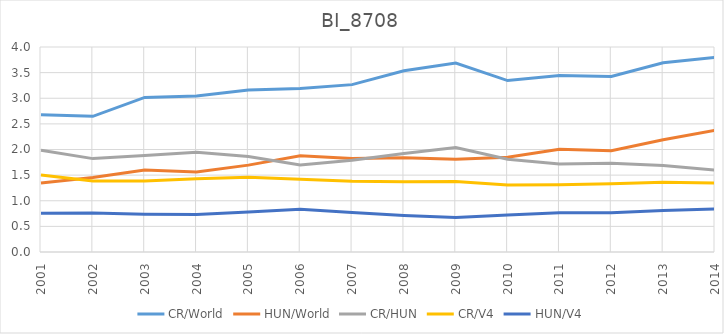
| Category | CR/World | HUN/World | CR/HUN | CR/V4 | HUN/V4 |
|---|---|---|---|---|---|
| 2001.0 | 2.676 | 1.347 | 1.986 | 1.502 | 0.757 |
| 2002.0 | 2.647 | 1.453 | 1.822 | 1.388 | 0.762 |
| 2003.0 | 3.016 | 1.6 | 1.884 | 1.388 | 0.736 |
| 2004.0 | 3.042 | 1.562 | 1.947 | 1.428 | 0.733 |
| 2005.0 | 3.161 | 1.695 | 1.865 | 1.46 | 0.783 |
| 2006.0 | 3.189 | 1.876 | 1.7 | 1.419 | 0.835 |
| 2007.0 | 3.266 | 1.823 | 1.792 | 1.379 | 0.77 |
| 2008.0 | 3.536 | 1.84 | 1.922 | 1.369 | 0.712 |
| 2009.0 | 3.687 | 1.81 | 2.037 | 1.374 | 0.674 |
| 2010.0 | 3.345 | 1.849 | 1.809 | 1.308 | 0.723 |
| 2011.0 | 3.444 | 2.006 | 1.717 | 1.311 | 0.764 |
| 2012.0 | 3.425 | 1.976 | 1.733 | 1.332 | 0.768 |
| 2013.0 | 3.691 | 2.19 | 1.685 | 1.362 | 0.808 |
| 2014.0 | 3.798 | 2.374 | 1.6 | 1.346 | 0.841 |